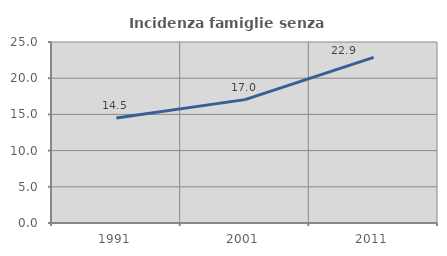
| Category | Incidenza famiglie senza nuclei |
|---|---|
| 1991.0 | 14.498 |
| 2001.0 | 17.039 |
| 2011.0 | 22.872 |